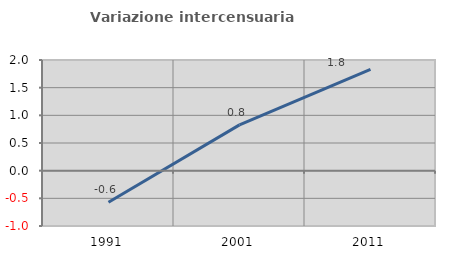
| Category | Variazione intercensuaria annua |
|---|---|
| 1991.0 | -0.57 |
| 2001.0 | 0.827 |
| 2011.0 | 1.832 |